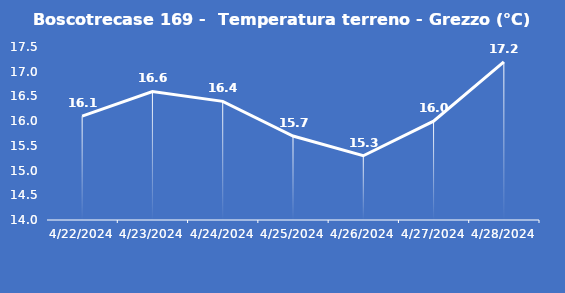
| Category | Boscotrecase 169 -  Temperatura terreno - Grezzo (°C) |
|---|---|
| 4/22/24 | 16.1 |
| 4/23/24 | 16.6 |
| 4/24/24 | 16.4 |
| 4/25/24 | 15.7 |
| 4/26/24 | 15.3 |
| 4/27/24 | 16 |
| 4/28/24 | 17.2 |